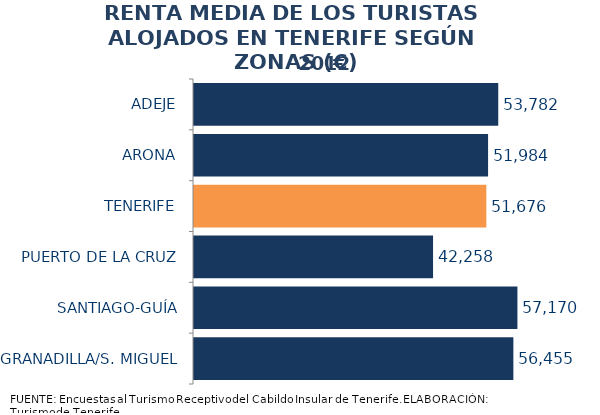
| Category | 2012 |
|---|---|
| ADEJE | 53781.62 |
| ARONA | 51983.734 |
| TENERIFE | 51676.16 |
| PUERTO DE LA CRUZ | 42257.625 |
| SANTIAGO-GUÍA | 57170.485 |
| GRANADILLA/S. MIGUEL | 56454.67 |